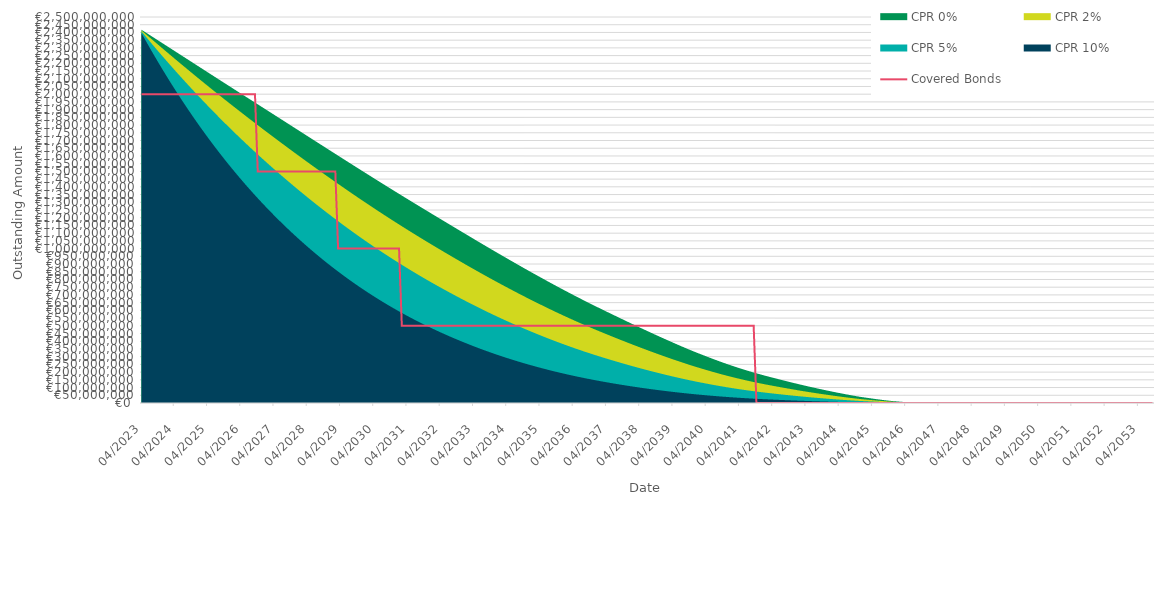
| Category | Covered Bonds |
|---|---|
| 2023-04-30 | 2000000000 |
| 2023-05-31 | 2000000000 |
| 2023-06-30 | 2000000000 |
| 2023-07-31 | 2000000000 |
| 2023-08-31 | 2000000000 |
| 2023-09-30 | 2000000000 |
| 2023-10-31 | 2000000000 |
| 2023-11-30 | 2000000000 |
| 2023-12-31 | 2000000000 |
| 2024-01-31 | 2000000000 |
| 2024-02-29 | 2000000000 |
| 2024-03-31 | 2000000000 |
| 2024-04-30 | 2000000000 |
| 2024-05-31 | 2000000000 |
| 2024-06-30 | 2000000000 |
| 2024-07-31 | 2000000000 |
| 2024-08-31 | 2000000000 |
| 2024-09-30 | 2000000000 |
| 2024-10-31 | 2000000000 |
| 2024-11-30 | 2000000000 |
| 2024-12-31 | 2000000000 |
| 2025-01-31 | 2000000000 |
| 2025-02-28 | 2000000000 |
| 2025-03-31 | 2000000000 |
| 2025-04-30 | 2000000000 |
| 2025-05-31 | 2000000000 |
| 2025-06-30 | 2000000000 |
| 2025-07-31 | 2000000000 |
| 2025-08-31 | 2000000000 |
| 2025-09-30 | 2000000000 |
| 2025-10-31 | 2000000000 |
| 2025-11-30 | 2000000000 |
| 2025-12-31 | 2000000000 |
| 2026-01-31 | 2000000000 |
| 2026-02-28 | 2000000000 |
| 2026-03-31 | 2000000000 |
| 2026-04-30 | 2000000000 |
| 2026-05-31 | 2000000000 |
| 2026-06-30 | 2000000000 |
| 2026-07-31 | 2000000000 |
| 2026-08-31 | 2000000000 |
| 2026-09-30 | 2000000000 |
| 2026-10-31 | 1500000000 |
| 2026-11-30 | 1500000000 |
| 2026-12-31 | 1500000000 |
| 2027-01-31 | 1500000000 |
| 2027-02-28 | 1500000000 |
| 2027-03-31 | 1500000000 |
| 2027-04-30 | 1500000000 |
| 2027-05-31 | 1500000000 |
| 2027-06-30 | 1500000000 |
| 2027-07-31 | 1500000000 |
| 2027-08-31 | 1500000000 |
| 2027-09-30 | 1500000000 |
| 2027-10-31 | 1500000000 |
| 2027-11-30 | 1500000000 |
| 2027-12-31 | 1500000000 |
| 2028-01-31 | 1500000000 |
| 2028-02-29 | 1500000000 |
| 2028-03-31 | 1500000000 |
| 2028-04-30 | 1500000000 |
| 2028-05-31 | 1500000000 |
| 2028-06-30 | 1500000000 |
| 2028-07-31 | 1500000000 |
| 2028-08-31 | 1500000000 |
| 2028-09-30 | 1500000000 |
| 2028-10-31 | 1500000000 |
| 2028-11-30 | 1500000000 |
| 2028-12-31 | 1500000000 |
| 2029-01-31 | 1500000000 |
| 2029-02-28 | 1500000000 |
| 2029-03-31 | 1000000000 |
| 2029-04-30 | 1000000000 |
| 2029-05-31 | 1000000000 |
| 2029-06-30 | 1000000000 |
| 2029-07-31 | 1000000000 |
| 2029-08-31 | 1000000000 |
| 2029-09-30 | 1000000000 |
| 2029-10-31 | 1000000000 |
| 2029-11-30 | 1000000000 |
| 2029-12-31 | 1000000000 |
| 2030-01-31 | 1000000000 |
| 2030-02-28 | 1000000000 |
| 2030-03-31 | 1000000000 |
| 2030-04-30 | 1000000000 |
| 2030-05-31 | 1000000000 |
| 2030-06-30 | 1000000000 |
| 2030-07-31 | 1000000000 |
| 2030-08-31 | 1000000000 |
| 2030-09-30 | 1000000000 |
| 2030-10-31 | 1000000000 |
| 2030-11-30 | 1000000000 |
| 2030-12-31 | 1000000000 |
| 2031-01-31 | 1000000000 |
| 2031-02-28 | 500000000 |
| 2031-03-31 | 500000000 |
| 2031-04-30 | 500000000 |
| 2031-05-31 | 500000000 |
| 2031-06-30 | 500000000 |
| 2031-07-31 | 500000000 |
| 2031-08-31 | 500000000 |
| 2031-09-30 | 500000000 |
| 2031-10-31 | 500000000 |
| 2031-11-30 | 500000000 |
| 2031-12-31 | 500000000 |
| 2032-01-31 | 500000000 |
| 2032-02-29 | 500000000 |
| 2032-03-31 | 500000000 |
| 2032-04-30 | 500000000 |
| 2032-05-31 | 500000000 |
| 2032-06-30 | 500000000 |
| 2032-07-31 | 500000000 |
| 2032-08-31 | 500000000 |
| 2032-09-30 | 500000000 |
| 2032-10-31 | 500000000 |
| 2032-11-30 | 500000000 |
| 2032-12-31 | 500000000 |
| 2033-01-31 | 500000000 |
| 2033-02-28 | 500000000 |
| 2033-03-31 | 500000000 |
| 2033-04-30 | 500000000 |
| 2033-05-31 | 500000000 |
| 2033-06-30 | 500000000 |
| 2033-07-31 | 500000000 |
| 2033-08-31 | 500000000 |
| 2033-09-30 | 500000000 |
| 2033-10-31 | 500000000 |
| 2033-11-30 | 500000000 |
| 2033-12-31 | 500000000 |
| 2034-01-31 | 500000000 |
| 2034-02-28 | 500000000 |
| 2034-03-31 | 500000000 |
| 2034-04-30 | 500000000 |
| 2034-05-31 | 500000000 |
| 2034-06-30 | 500000000 |
| 2034-07-31 | 500000000 |
| 2034-08-31 | 500000000 |
| 2034-09-30 | 500000000 |
| 2034-10-31 | 500000000 |
| 2034-11-30 | 500000000 |
| 2034-12-31 | 500000000 |
| 2035-01-31 | 500000000 |
| 2035-02-28 | 500000000 |
| 2035-03-31 | 500000000 |
| 2035-04-30 | 500000000 |
| 2035-05-31 | 500000000 |
| 2035-06-30 | 500000000 |
| 2035-07-31 | 500000000 |
| 2035-08-31 | 500000000 |
| 2035-09-30 | 500000000 |
| 2035-10-31 | 500000000 |
| 2035-11-30 | 500000000 |
| 2035-12-31 | 500000000 |
| 2036-01-31 | 500000000 |
| 2036-02-29 | 500000000 |
| 2036-03-31 | 500000000 |
| 2036-04-30 | 500000000 |
| 2036-05-31 | 500000000 |
| 2036-06-30 | 500000000 |
| 2036-07-31 | 500000000 |
| 2036-08-31 | 500000000 |
| 2036-09-30 | 500000000 |
| 2036-10-31 | 500000000 |
| 2036-11-30 | 500000000 |
| 2036-12-31 | 500000000 |
| 2037-01-31 | 500000000 |
| 2037-02-28 | 500000000 |
| 2037-03-31 | 500000000 |
| 2037-04-30 | 500000000 |
| 2037-05-31 | 500000000 |
| 2037-06-30 | 500000000 |
| 2037-07-31 | 500000000 |
| 2037-08-31 | 500000000 |
| 2037-09-30 | 500000000 |
| 2037-10-31 | 500000000 |
| 2037-11-30 | 500000000 |
| 2037-12-31 | 500000000 |
| 2038-01-31 | 500000000 |
| 2038-02-28 | 500000000 |
| 2038-03-31 | 500000000 |
| 2038-04-30 | 500000000 |
| 2038-05-31 | 500000000 |
| 2038-06-30 | 500000000 |
| 2038-07-31 | 500000000 |
| 2038-08-31 | 500000000 |
| 2038-09-30 | 500000000 |
| 2038-10-31 | 500000000 |
| 2038-11-30 | 500000000 |
| 2038-12-31 | 500000000 |
| 2039-01-31 | 500000000 |
| 2039-02-28 | 500000000 |
| 2039-03-31 | 500000000 |
| 2039-04-30 | 500000000 |
| 2039-05-31 | 500000000 |
| 2039-06-30 | 500000000 |
| 2039-07-31 | 500000000 |
| 2039-08-31 | 500000000 |
| 2039-09-30 | 500000000 |
| 2039-10-31 | 500000000 |
| 2039-11-30 | 500000000 |
| 2039-12-31 | 500000000 |
| 2040-01-31 | 500000000 |
| 2040-02-29 | 500000000 |
| 2040-03-31 | 500000000 |
| 2040-04-30 | 500000000 |
| 2040-05-31 | 500000000 |
| 2040-06-30 | 500000000 |
| 2040-07-31 | 500000000 |
| 2040-08-31 | 500000000 |
| 2040-09-30 | 500000000 |
| 2040-10-31 | 500000000 |
| 2040-11-30 | 500000000 |
| 2040-12-31 | 500000000 |
| 2041-01-31 | 500000000 |
| 2041-02-28 | 500000000 |
| 2041-03-31 | 500000000 |
| 2041-04-30 | 500000000 |
| 2041-05-31 | 500000000 |
| 2041-06-30 | 500000000 |
| 2041-07-31 | 500000000 |
| 2041-08-31 | 500000000 |
| 2041-09-30 | 500000000 |
| 2041-10-31 | 0 |
| 2041-11-30 | 0 |
| 2041-12-31 | 0 |
| 2042-01-31 | 0 |
| 2042-02-28 | 0 |
| 2042-03-31 | 0 |
| 2042-04-30 | 0 |
| 2042-05-31 | 0 |
| 2042-06-30 | 0 |
| 2042-07-31 | 0 |
| 2042-08-31 | 0 |
| 2042-09-30 | 0 |
| 2042-10-31 | 0 |
| 2042-11-30 | 0 |
| 2042-12-31 | 0 |
| 2043-01-31 | 0 |
| 2043-02-28 | 0 |
| 2043-03-31 | 0 |
| 2043-04-30 | 0 |
| 2043-05-31 | 0 |
| 2043-06-30 | 0 |
| 2043-07-31 | 0 |
| 2043-08-31 | 0 |
| 2043-09-30 | 0 |
| 2043-10-31 | 0 |
| 2043-11-30 | 0 |
| 2043-12-31 | 0 |
| 2044-01-31 | 0 |
| 2044-02-29 | 0 |
| 2044-03-31 | 0 |
| 2044-04-30 | 0 |
| 2044-05-31 | 0 |
| 2044-06-30 | 0 |
| 2044-07-31 | 0 |
| 2044-08-31 | 0 |
| 2044-09-30 | 0 |
| 2044-10-31 | 0 |
| 2044-11-30 | 0 |
| 2044-12-31 | 0 |
| 2045-01-31 | 0 |
| 2045-02-28 | 0 |
| 2045-03-31 | 0 |
| 2045-04-30 | 0 |
| 2045-05-31 | 0 |
| 2045-06-30 | 0 |
| 2045-07-31 | 0 |
| 2045-08-31 | 0 |
| 2045-09-30 | 0 |
| 2045-10-31 | 0 |
| 2045-11-30 | 0 |
| 2045-12-31 | 0 |
| 2046-01-31 | 0 |
| 2046-02-28 | 0 |
| 2046-03-31 | 0 |
| 2046-04-30 | 0 |
| 2046-05-31 | 0 |
| 2046-06-30 | 0 |
| 2046-07-31 | 0 |
| 2046-08-31 | 0 |
| 2046-09-30 | 0 |
| 2046-10-31 | 0 |
| 2046-11-30 | 0 |
| 2046-12-31 | 0 |
| 2047-01-31 | 0 |
| 2047-02-28 | 0 |
| 2047-03-31 | 0 |
| 2047-04-30 | 0 |
| 2047-05-31 | 0 |
| 2047-06-30 | 0 |
| 2047-07-31 | 0 |
| 2047-08-31 | 0 |
| 2047-09-30 | 0 |
| 2047-10-31 | 0 |
| 2047-11-30 | 0 |
| 2047-12-31 | 0 |
| 2048-01-31 | 0 |
| 2048-02-29 | 0 |
| 2048-03-31 | 0 |
| 2048-04-30 | 0 |
| 2048-05-31 | 0 |
| 2048-06-30 | 0 |
| 2048-07-31 | 0 |
| 2048-08-31 | 0 |
| 2048-09-30 | 0 |
| 2048-10-31 | 0 |
| 2048-11-30 | 0 |
| 2048-12-31 | 0 |
| 2049-01-31 | 0 |
| 2049-02-28 | 0 |
| 2049-03-31 | 0 |
| 2049-04-30 | 0 |
| 2049-05-31 | 0 |
| 2049-06-30 | 0 |
| 2049-07-31 | 0 |
| 2049-08-31 | 0 |
| 2049-09-30 | 0 |
| 2049-10-31 | 0 |
| 2049-11-30 | 0 |
| 2049-12-31 | 0 |
| 2050-01-31 | 0 |
| 2050-02-28 | 0 |
| 2050-03-31 | 0 |
| 2050-04-30 | 0 |
| 2050-05-31 | 0 |
| 2050-06-30 | 0 |
| 2050-07-31 | 0 |
| 2050-08-31 | 0 |
| 2050-09-30 | 0 |
| 2050-10-31 | 0 |
| 2050-11-30 | 0 |
| 2050-12-31 | 0 |
| 2051-01-31 | 0 |
| 2051-02-28 | 0 |
| 2051-03-31 | 0 |
| 2051-04-30 | 0 |
| 2051-05-31 | 0 |
| 2051-06-30 | 0 |
| 2051-07-31 | 0 |
| 2051-08-31 | 0 |
| 2051-09-30 | 0 |
| 2051-10-31 | 0 |
| 2051-11-30 | 0 |
| 2051-12-31 | 0 |
| 2052-01-31 | 0 |
| 2052-02-29 | 0 |
| 2052-03-31 | 0 |
| 2052-04-30 | 0 |
| 2052-05-31 | 0 |
| 2052-06-30 | 0 |
| 2052-07-31 | 0 |
| 2052-08-31 | 0 |
| 2052-09-30 | 0 |
| 2052-10-31 | 0 |
| 2052-11-30 | 0 |
| 2052-12-31 | 0 |
| 2053-01-31 | 0 |
| 2053-02-28 | 0 |
| 2053-03-31 | 0 |
| 2053-04-30 | 0 |
| 2053-05-31 | 0 |
| 2053-06-30 | 0 |
| 2053-07-31 | 0 |
| 2053-08-31 | 0 |
| 2053-09-30 | 0 |